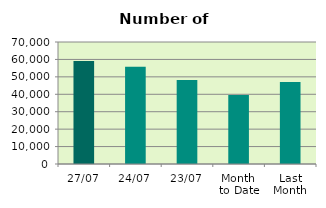
| Category | Series 0 |
|---|---|
| 27/07 | 59072 |
| 24/07 | 55760 |
| 23/07 | 48132 |
| Month 
to Date | 39622.947 |
| Last
Month | 46980.273 |